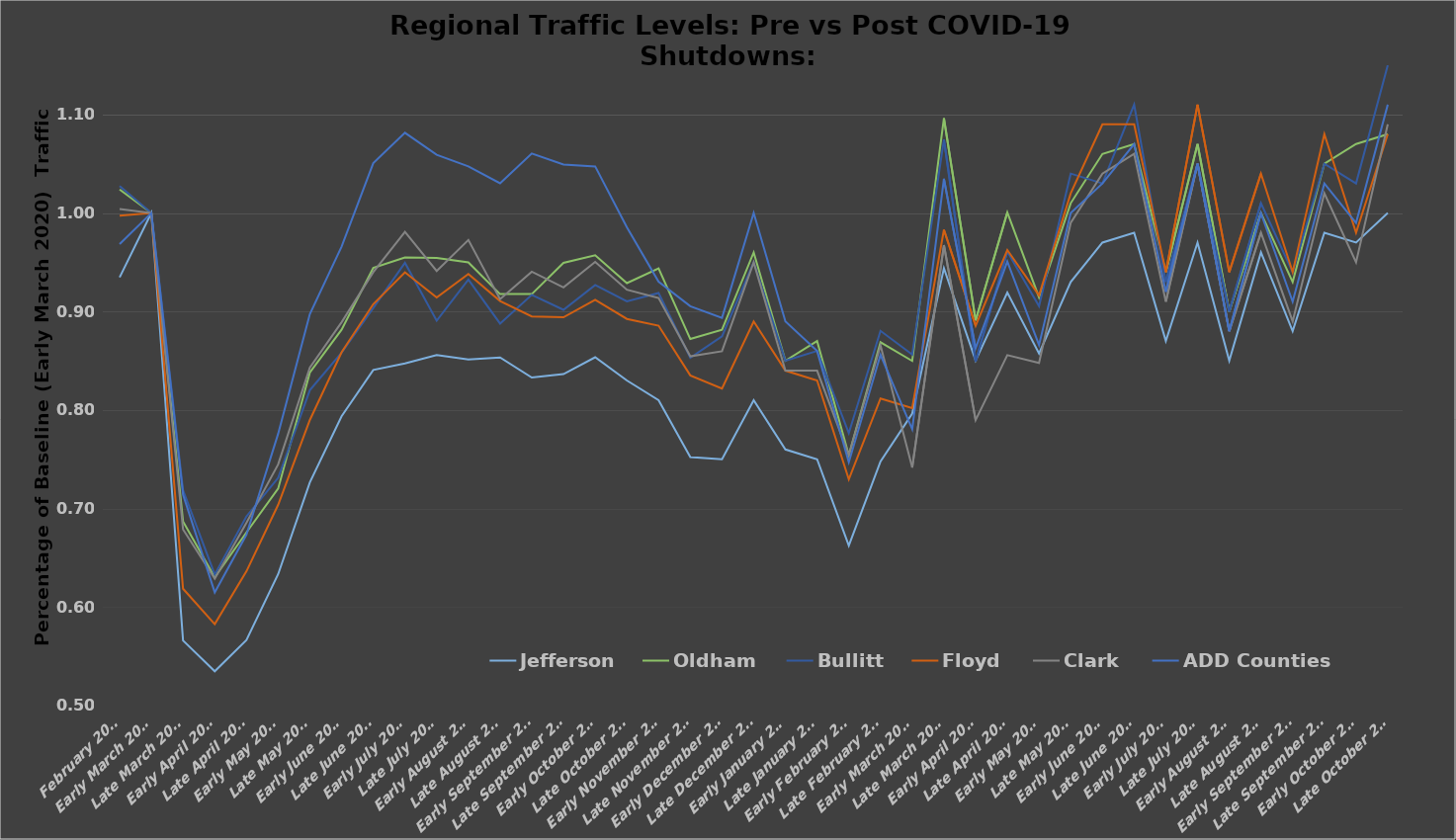
| Category | Jefferson | Oldham | Bullitt | Floyd | Clark | ADD Counties |
|---|---|---|---|---|---|---|
| February 2020 | 0.935 | 1.024 | 1.027 | 0.997 | 1.004 | 0.968 |
| Early March 2020 | 1 | 1 | 1 | 1 | 1 | 1 |
| Late March 2020 | 0.566 | 0.687 | 0.719 | 0.619 | 0.679 | 0.714 |
| Early April 2020 | 0.535 | 0.63 | 0.633 | 0.583 | 0.629 | 0.615 |
| Late April 2020 | 0.567 | 0.676 | 0.692 | 0.636 | 0.686 | 0.673 |
| Early May 2020 | 0.633 | 0.72 | 0.731 | 0.704 | 0.745 | 0.776 |
| Late May 2020 | 0.727 | 0.838 | 0.82 | 0.79 | 0.843 | 0.898 |
| Early June 2020 | 0.794 | 0.882 | 0.858 | 0.859 | 0.889 | 0.966 |
| Late June 2020 | 0.841 | 0.944 | 0.904 | 0.907 | 0.94 | 1.051 |
| Early July 2020 | 0.847 | 0.955 | 0.949 | 0.94 | 0.981 | 1.081 |
| Late July 2020 | 0.856 | 0.954 | 0.891 | 0.914 | 0.941 | 1.059 |
| Early August 2020 | 0.851 | 0.95 | 0.932 | 0.938 | 0.973 | 1.047 |
| Late August 2020 | 0.853 | 0.918 | 0.888 | 0.911 | 0.913 | 1.03 |
| Early September 2020 | 0.833 | 0.918 | 0.917 | 0.895 | 0.94 | 1.06 |
| Late September 2020 | 0.836 | 0.949 | 0.902 | 0.894 | 0.924 | 1.049 |
| Early October 2020 | 0.854 | 0.957 | 0.927 | 0.912 | 0.95 | 1.047 |
| Late October 2020 | 0.83 | 0.929 | 0.91 | 0.893 | 0.922 | 0.986 |
| Early November 2020 | 0.81 | 0.944 | 0.919 | 0.886 | 0.914 | 0.93 |
| Late November 2020 | 0.752 | 0.872 | 0.853 | 0.835 | 0.855 | 0.905 |
| Early December 2020 | 0.75 | 0.882 | 0.875 | 0.822 | 0.86 | 0.894 |
| Late December 2020 | 0.81 | 0.96 | 0.95 | 0.89 | 0.95 | 1 |
| Early January 2021 | 0.76 | 0.85 | 0.85 | 0.84 | 0.84 | 0.89 |
| Late January 2021 | 0.75 | 0.87 | 0.86 | 0.83 | 0.84 | 0.86 |
| Early February 2021 | 0.662 | 0.754 | 0.777 | 0.73 | 0.754 | 0.747 |
| Late February 2021 | 0.748 | 0.869 | 0.88 | 0.812 | 0.866 | 0.856 |
| Early March 2021 | 0.796 | 0.85 | 0.856 | 0.802 | 0.742 | 0.781 |
| Late March 2021 | 0.944 | 1.096 | 1.075 | 0.983 | 0.967 | 1.035 |
| Early April 2021 | 0.85 | 0.891 | 0.849 | 0.886 | 0.79 | 0.863 |
| Late April 2021 | 0.919 | 1.001 | 0.961 | 0.962 | 0.856 | 0.951 |
| Early May 2021 | 0.857 | 0.914 | 0.905 | 0.916 | 0.848 | 0.866 |
| Late May 2021 | 0.93 | 1.01 | 1.04 | 1.02 | 0.99 | 1 |
| Early June 2021 | 0.97 | 1.06 | 1.03 | 1.09 | 1.04 | 1.03 |
| Late June 2021 | 0.98 | 1.07 | 1.11 | 1.09 | 1.06 | 1.07 |
| Early July 2021 | 0.87 | 0.94 | 0.93 | 0.94 | 0.91 | 0.92 |
| Late July 2021 | 0.97 | 1.07 | 1.05 | 1.11 | 1.05 | 1.05 |
| Early August 2021 | 0.85 | 0.9 | 0.9 | 0.94 | 0.88 | 0.88 |
| Late August 2021 | 0.96 | 1 | 1.01 | 1.04 | 0.98 | 1 |
| Early September 2021 | 0.88 | 0.93 | 0.94 | 0.94 | 0.89 | 0.91 |
| Late September 2021 | 0.98 | 1.05 | 1.05 | 1.08 | 1.02 | 1.03 |
| Early October 2021 | 0.97 | 1.07 | 1.03 | 0.98 | 0.95 | 0.99 |
| Late October 2021 | 1 | 1.08 | 1.15 | 1.08 | 1.09 | 1.11 |